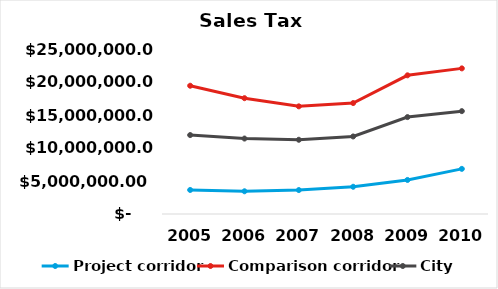
| Category | Project corridor | Comparison corridor | City |
|---|---|---|---|
| 2005.0 | 3641661 | 19433660 | 11960142.333 |
| 2006.0 | 3442547 | 17548748 | 11432133.667 |
| 2007.0 | 3627308 | 16310272 | 11247562 |
| 2008.0 | 4127308 | 16810272 | 11747562 |
| 2009.0 | 5159135 | 21012840 | 14684452.5 |
| 2010.0 | 6838949.356 | 22063482 | 15585721.504 |